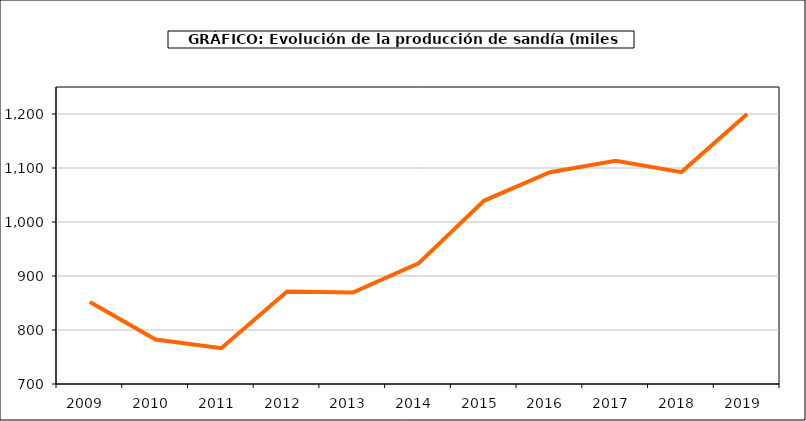
| Category | producción |
|---|---|
| 2009.0 | 851.976 |
| 2010.0 | 782.43 |
| 2011.0 | 766.301 |
| 2012.0 | 871.324 |
| 2013.0 | 869.499 |
| 2014.0 | 923.32 |
| 2015.0 | 1039.698 |
| 2016.0 | 1092.075 |
| 2017.0 | 1113.192 |
| 2018.0 | 1092.401 |
| 2019.0 | 1200.093 |